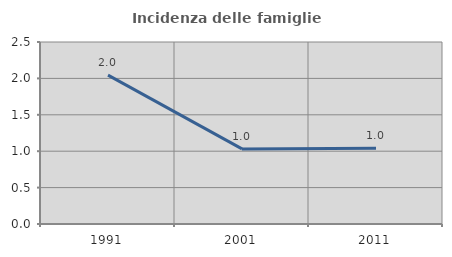
| Category | Incidenza delle famiglie numerose |
|---|---|
| 1991.0 | 2.045 |
| 2001.0 | 1.031 |
| 2011.0 | 1.041 |